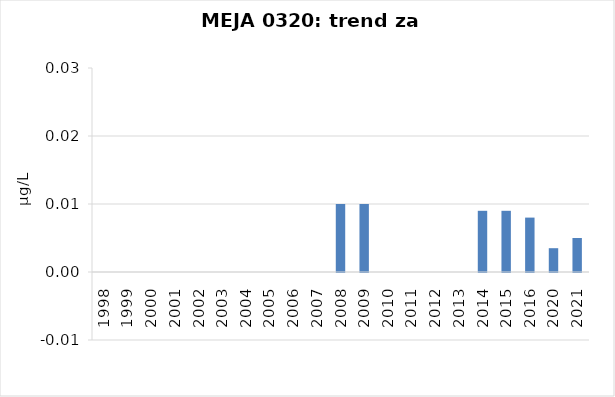
| Category | Vsota |
|---|---|
| 1998 | 0 |
| 1999 | 0 |
| 2000 | 0 |
| 2001 | 0 |
| 2002 | 0 |
| 2003 | 0 |
| 2004 | 0 |
| 2005 | 0 |
| 2006 | 0 |
| 2007 | 0 |
| 2008 | 0.01 |
| 2009 | 0.01 |
| 2010 | 0 |
| 2011 | 0 |
| 2012 | 0 |
| 2013 | 0 |
| 2014 | 0.009 |
| 2015 | 0.009 |
| 2016 | 0.008 |
| 2020 | 0.004 |
| 2021 | 0.005 |